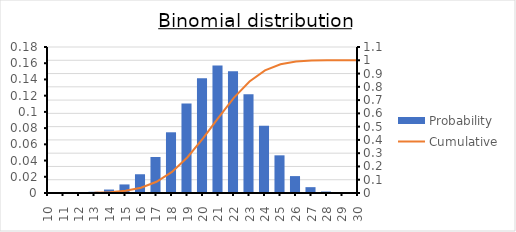
| Category | Probability |
|---|---|
| 10.0 | 0 |
| 11.0 | 0 |
| 12.0 | 0 |
| 13.0 | 0.001 |
| 14.0 | 0.004 |
| 15.0 | 0.011 |
| 16.0 | 0.023 |
| 17.0 | 0.044 |
| 18.0 | 0.075 |
| 19.0 | 0.11 |
| 20.0 | 0.142 |
| 21.0 | 0.157 |
| 22.0 | 0.15 |
| 23.0 | 0.122 |
| 24.0 | 0.083 |
| 25.0 | 0.046 |
| 26.0 | 0.021 |
| 27.0 | 0.007 |
| 28.0 | 0.002 |
| 29.0 | 0 |
| 30.0 | 0 |